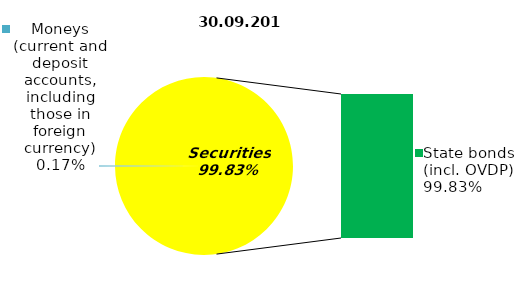
| Category | Series 0 |
|---|---|
| Moneys (current and deposit accounts, including those in foreign currency) | 0.17 |
| Bank metals | 0 |
| Real estate | 0 |
| Other assets | 0 |
| Equities | 0 |
| Corporate bonds | 0 |
| Municipal bonds | 0 |
| State bonds (incl. OVDP) | 97.58 |
| Mortgage Certificates | 0 |